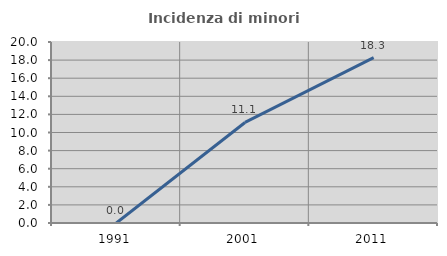
| Category | Incidenza di minori stranieri |
|---|---|
| 1991.0 | 0 |
| 2001.0 | 11.111 |
| 2011.0 | 18.269 |